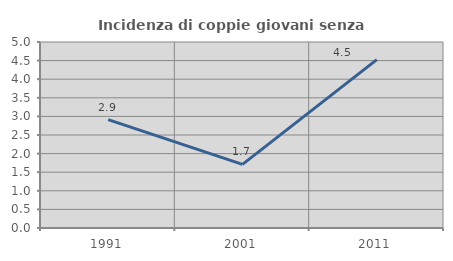
| Category | Incidenza di coppie giovani senza figli |
|---|---|
| 1991.0 | 2.913 |
| 2001.0 | 1.709 |
| 2011.0 | 4.527 |